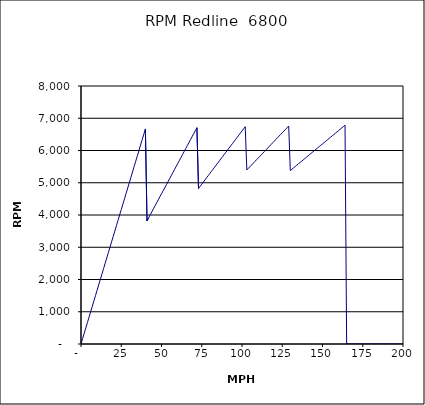
| Category | RPM Redline  6800 |
|---|---|
| 0.0 | 0 |
| 1.0 | 166.721 |
| 2.0 | 333.442 |
| 3.0 | 500.163 |
| 4.0 | 666.884 |
| 5.0 | 833.605 |
| 6.0 | 1000.326 |
| 7.0 | 1167.047 |
| 8.0 | 1333.768 |
| 9.0 | 1500.489 |
| 10.0 | 1667.21 |
| 11.0 | 1833.931 |
| 12.0 | 2000.652 |
| 13.0 | 2167.373 |
| 14.0 | 2334.094 |
| 15.0 | 2500.815 |
| 16.0 | 2667.536 |
| 17.0 | 2834.257 |
| 18.0 | 3000.978 |
| 19.0 | 3167.699 |
| 20.0 | 3334.42 |
| 21.0 | 3501.141 |
| 22.0 | 3667.862 |
| 23.0 | 3834.583 |
| 24.0 | 4001.303 |
| 25.0 | 4168.024 |
| 26.0 | 4334.745 |
| 27.0 | 4501.466 |
| 28.0 | 4668.187 |
| 29.0 | 4834.908 |
| 30.0 | 5001.629 |
| 31.0 | 5168.35 |
| 32.0 | 5335.071 |
| 33.0 | 5501.792 |
| 34.0 | 5668.513 |
| 35.0 | 5835.234 |
| 36.0 | 6001.955 |
| 37.0 | 6168.676 |
| 38.0 | 6335.397 |
| 39.0 | 6502.118 |
| 40.0 | 6668.839 |
| 41.0 | 3819.234 |
| 42.0 | 3912.386 |
| 43.0 | 4005.538 |
| 44.0 | 4098.69 |
| 45.0 | 4191.842 |
| 46.0 | 4284.994 |
| 47.0 | 4378.146 |
| 48.0 | 4471.298 |
| 49.0 | 4564.45 |
| 50.0 | 4657.602 |
| 51.0 | 4750.754 |
| 52.0 | 4843.906 |
| 53.0 | 4937.058 |
| 54.0 | 5030.21 |
| 55.0 | 5123.362 |
| 56.0 | 5216.514 |
| 57.0 | 5309.666 |
| 58.0 | 5402.818 |
| 59.0 | 5495.97 |
| 60.0 | 5589.122 |
| 61.0 | 5682.274 |
| 62.0 | 5775.426 |
| 63.0 | 5868.578 |
| 64.0 | 5961.73 |
| 65.0 | 6054.883 |
| 66.0 | 6148.035 |
| 67.0 | 6241.187 |
| 68.0 | 6334.339 |
| 69.0 | 6427.491 |
| 70.0 | 6520.643 |
| 71.0 | 6613.795 |
| 72.0 | 6706.947 |
| 73.0 | 4822.896 |
| 74.0 | 4888.963 |
| 75.0 | 4955.03 |
| 76.0 | 5021.097 |
| 77.0 | 5087.164 |
| 78.0 | 5153.232 |
| 79.0 | 5219.299 |
| 80.0 | 5285.366 |
| 81.0 | 5351.433 |
| 82.0 | 5417.5 |
| 83.0 | 5483.567 |
| 84.0 | 5549.634 |
| 85.0 | 5615.701 |
| 86.0 | 5681.768 |
| 87.0 | 5747.835 |
| 88.0 | 5813.902 |
| 89.0 | 5879.969 |
| 90.0 | 5946.036 |
| 91.0 | 6012.103 |
| 92.0 | 6078.171 |
| 93.0 | 6144.238 |
| 94.0 | 6210.305 |
| 95.0 | 6276.372 |
| 96.0 | 6342.439 |
| 97.0 | 6408.506 |
| 98.0 | 6474.573 |
| 99.0 | 6540.64 |
| 100.0 | 6606.707 |
| 101.0 | 6672.774 |
| 102.0 | 6738.841 |
| 103.0 | 5396.996 |
| 104.0 | 5449.394 |
| 105.0 | 5501.792 |
| 106.0 | 5554.19 |
| 107.0 | 5606.588 |
| 108.0 | 5658.986 |
| 109.0 | 5711.384 |
| 110.0 | 5763.782 |
| 111.0 | 5816.18 |
| 112.0 | 5868.578 |
| 113.0 | 5920.976 |
| 114.0 | 5973.374 |
| 115.0 | 6025.773 |
| 116.0 | 6078.171 |
| 117.0 | 6130.569 |
| 118.0 | 6182.967 |
| 119.0 | 6235.365 |
| 120.0 | 6287.763 |
| 121.0 | 6340.161 |
| 122.0 | 6392.559 |
| 123.0 | 6444.957 |
| 124.0 | 6497.355 |
| 125.0 | 6549.753 |
| 126.0 | 6602.151 |
| 127.0 | 6654.549 |
| 128.0 | 6706.947 |
| 129.0 | 6759.345 |
| 130.0 | 5377.692 |
| 131.0 | 5419.059 |
| 132.0 | 5460.425 |
| 133.0 | 5501.792 |
| 134.0 | 5543.159 |
| 135.0 | 5584.526 |
| 136.0 | 5625.893 |
| 137.0 | 5667.26 |
| 138.0 | 5708.627 |
| 139.0 | 5749.993 |
| 140.0 | 5791.36 |
| 141.0 | 5832.727 |
| 142.0 | 5874.094 |
| 143.0 | 5915.461 |
| 144.0 | 5956.828 |
| 145.0 | 5998.195 |
| 146.0 | 6039.561 |
| 147.0 | 6080.928 |
| 148.0 | 6122.295 |
| 149.0 | 6163.662 |
| 150.0 | 6205.029 |
| 151.0 | 6246.396 |
| 152.0 | 6287.763 |
| 153.0 | 6329.129 |
| 154.0 | 6370.496 |
| 155.0 | 6411.863 |
| 156.0 | 6453.23 |
| 157.0 | 6494.597 |
| 158.0 | 6535.964 |
| 159.0 | 6577.331 |
| 160.0 | 6618.697 |
| 161.0 | 6660.064 |
| 162.0 | 6701.431 |
| 163.0 | 6742.798 |
| 164.0 | 6784.165 |
| 165.0 | 0 |
| 166.0 | 0 |
| 167.0 | 0 |
| 168.0 | 0 |
| 169.0 | 0 |
| 170.0 | 0 |
| 171.0 | 0 |
| 172.0 | 0 |
| 173.0 | 0 |
| 174.0 | 0 |
| 175.0 | 0 |
| 176.0 | 0 |
| 177.0 | 0 |
| 178.0 | 0 |
| 179.0 | 0 |
| 180.0 | 0 |
| 181.0 | 0 |
| 182.0 | 0 |
| 183.0 | 0 |
| 184.0 | 0 |
| 185.0 | 0 |
| 186.0 | 0 |
| 187.0 | 0 |
| 188.0 | 0 |
| 189.0 | 0 |
| 190.0 | 0 |
| 191.0 | 0 |
| 192.0 | 0 |
| 193.0 | 0 |
| 194.0 | 0 |
| 195.0 | 0 |
| 196.0 | 0 |
| 197.0 | 0 |
| 198.0 | 0 |
| 199.0 | 0 |
| 200.0 | 0 |